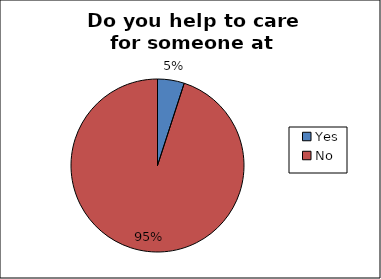
| Category | Series 0 |
|---|---|
| Yes | 0.05 |
| No | 0.95 |